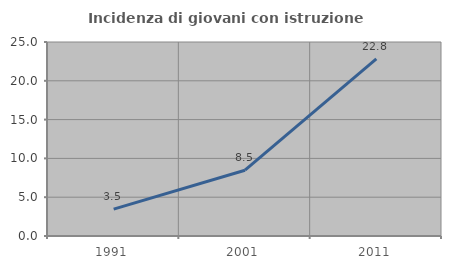
| Category | Incidenza di giovani con istruzione universitaria |
|---|---|
| 1991.0 | 3.46 |
| 2001.0 | 8.478 |
| 2011.0 | 22.822 |